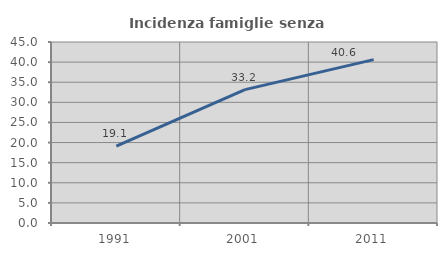
| Category | Incidenza famiglie senza nuclei |
|---|---|
| 1991.0 | 19.115 |
| 2001.0 | 33.152 |
| 2011.0 | 40.617 |